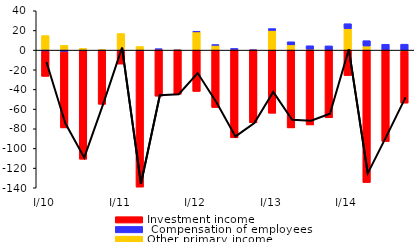
| Category | Other primary income |  Compensation of employees | Investment income |
|---|---|---|---|
| I/10 | 14.773 | -1.446 | -25.236 |
| II | 4.877 | -1.972 | -77.154 |
| III | 1.775 | -0.726 | -110.19 |
| IV | 0.471 | -1.005 | -54.098 |
| I/11 | 16.905 | -1.179 | -13.01 |
| II | 3.673 | -0.898 | -138.45 |
| III | 0.917 | 0.182 | -46.828 |
| IV | 0.201 | -0.359 | -44.5 |
| I/12 | 18.684 | 0.227 | -41.994 |
| II | 5.046 | 0.336 | -58.363 |
| III | 0.625 | 1.034 | -89.224 |
| IV | 0.042 | -0.116 | -73.825 |
| I/13 | 19.989 | 1.936 | -64.207 |
| II | 5.367 | 3.108 | -79.099 |
| III | 0.9 | 3.539 | -76.077 |
| IV | -0.021 | 4.321 | -68.775 |
| I/14 | 21.825 | 5.021 | -25.838 |
| II | 4.194 | 5.405 | -134.69 |
| III | 0.166 | 5.79 | -92.96 |
| IV | -1.284 | 6.025 | -52.617 |